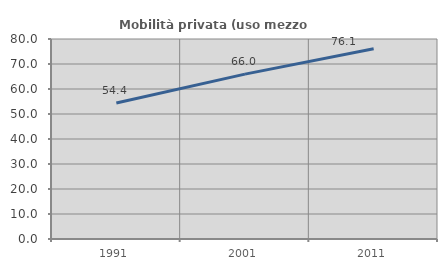
| Category | Mobilità privata (uso mezzo privato) |
|---|---|
| 1991.0 | 54.422 |
| 2001.0 | 65.956 |
| 2011.0 | 76.102 |